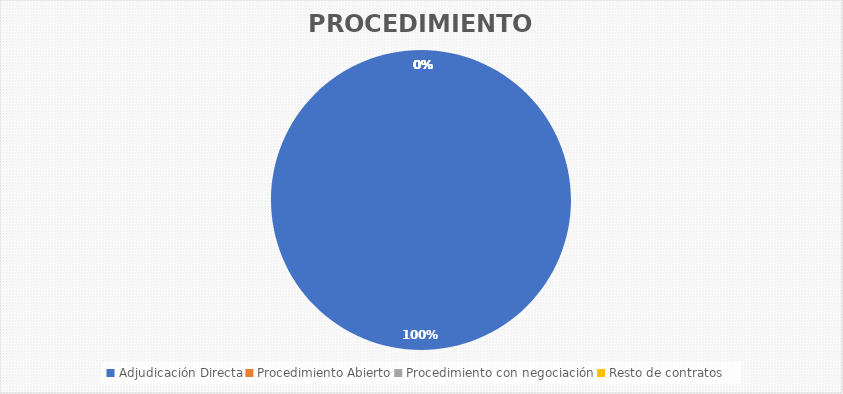
| Category | IVA incluido |
|---|---|
| Adjudicación Directa | 4712.9 |
| Procedimiento Abierto | 0 |
| Procedimiento con negociación | 0 |
| Resto de contratos | 0 |